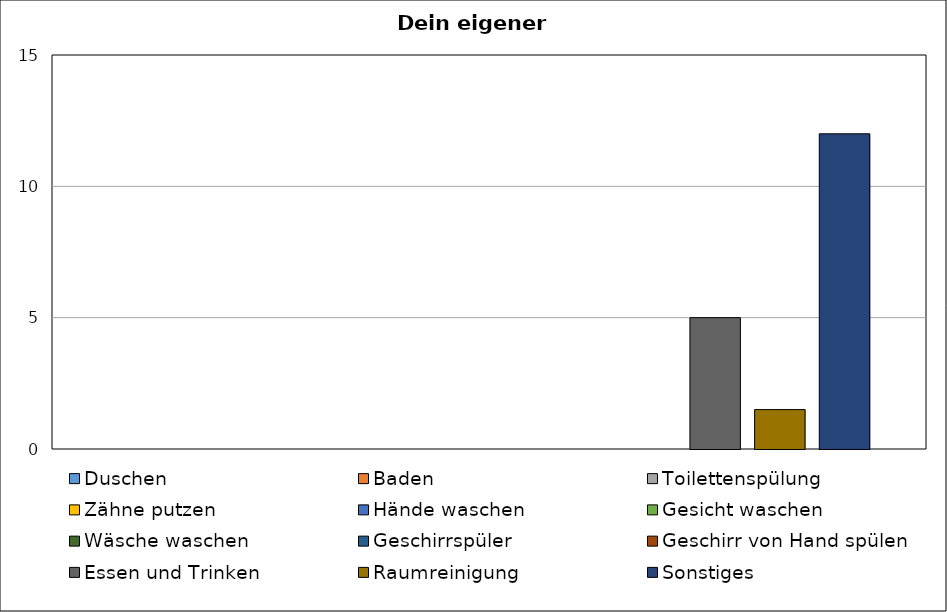
| Category | Duschen | Baden | Toilettenspülung | Zähne putzen | Hände waschen | Gesicht waschen | Wäsche waschen | Geschirrspüler | Geschirr von Hand spülen | Essen und Trinken | Raumreinigung | Sonstiges |
|---|---|---|---|---|---|---|---|---|---|---|---|---|
| 0 | 0 | 0 | 0 | 0 | 0 | 0 | 0 | 0 | 0 | 5 | 1.5 | 12 |